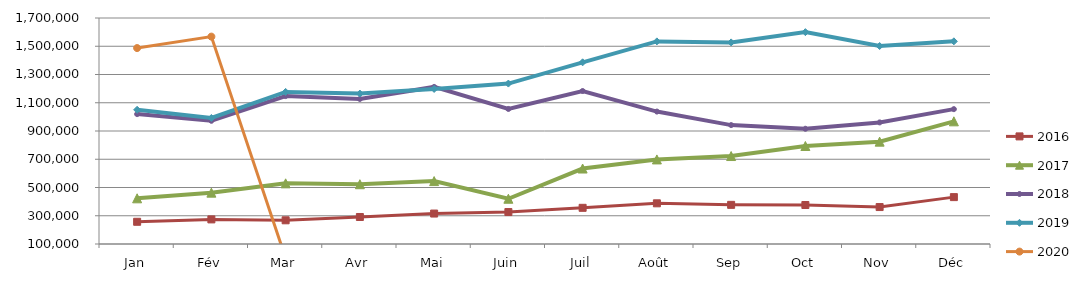
| Category | 2015 | 2016 | 2017 | 2018 | 2019 | 2020 |
|---|---|---|---|---|---|---|
| Jan |  | 257238.227 | 423360.679 | 1019658.015 | 1050220.805 | 1487095.506 |
| Fév |  | 274182.928 | 463512.001 | 972274.256 | 992184.961 | 1568141.915 |
| Mar |  | 267739.55 | 529345.368 | 1147166.528 | 1176757.88 | 0 |
| Avr |  | 291238.37 | 523228.337 | 1126714.531 | 1164825.987 | 0 |
| Mai |  | 315573.949 | 545414.731 | 1212070.878 | 1197851.486 | 0 |
| Juin |  | 326203.362 | 420430.116 | 1056092.947 | 1235809.908 | 0 |
| Juil |  | 356111.54 | 634345.533 | 1183060.966 | 1386180.582 | 0 |
| Août |  | 388007.58 | 698691.374 | 1037606.311 | 1534426.4 | 0 |
| Sep |  | 377114.56 | 722782.357 | 941820.554 | 1527323.009 | 0 |
| Oct |  | 376009.188 | 793837.955 | 915772.772 | 1599889.902 | 0 |
| Nov |  | 361587.784 | 824574.744 | 960817.552 | 1501599.407 | 0 |
| Déc |  | 431907.412 | 968412.649 | 1054685.303 | 1534756.751 | 0 |